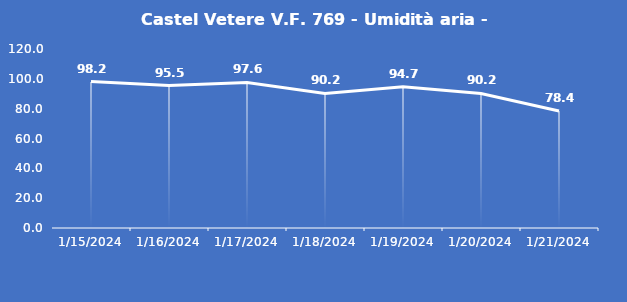
| Category | Castel Vetere V.F. 769 - Umidità aria - Grezzo (%) |
|---|---|
| 1/15/24 | 98.2 |
| 1/16/24 | 95.5 |
| 1/17/24 | 97.6 |
| 1/18/24 | 90.2 |
| 1/19/24 | 94.7 |
| 1/20/24 | 90.2 |
| 1/21/24 | 78.4 |